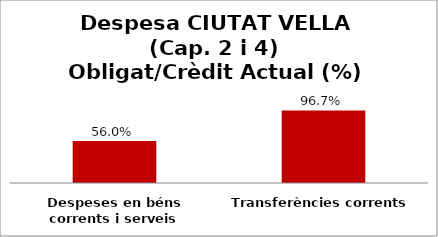
| Category | Series 0 |
|---|---|
| Despeses en béns corrents i serveis | 0.56 |
| Transferències corrents | 0.967 |